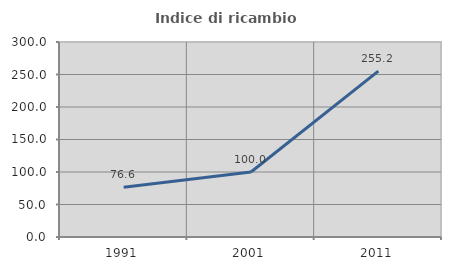
| Category | Indice di ricambio occupazionale  |
|---|---|
| 1991.0 | 76.596 |
| 2001.0 | 100 |
| 2011.0 | 255.172 |